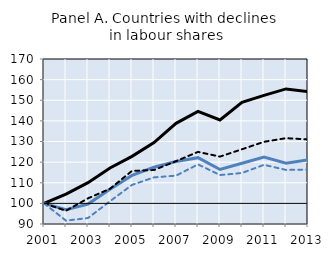
| Category | Labour productivity (Leaders) | Labour productivity (Others) | Real wages (Leaders) | Real wages (Others) | Series 4 |
|---|---|---|---|---|---|
| 2001.0 | 100 | 100 | 100 | 100 |  |
| 2002.0 | 104.525 | 96.957 | 96.423 | 91.634 |  |
| 2003.0 | 110.036 | 99.655 | 102.445 | 92.895 |  |
| 2004.0 | 117.162 | 106.9 | 107.083 | 101.028 |  |
| 2005.0 | 122.787 | 113.545 | 115.755 | 108.959 |  |
| 2006.0 | 129.467 | 117.547 | 116.161 | 112.606 |  |
| 2007.0 | 138.794 | 120.321 | 120.465 | 113.453 |  |
| 2008.0 | 144.59 | 122.159 | 124.954 | 118.897 |  |
| 2009.0 | 140.437 | 116.434 | 122.672 | 113.743 |  |
| 2010.0 | 148.991 | 119.444 | 126.249 | 114.738 |  |
| 2011.0 | 152.381 | 122.425 | 129.85 | 118.69 |  |
| 2012.0 | 155.489 | 119.451 | 131.611 | 116.23 |  |
| 2013.0 | 154.128 | 121.101 | 130.999 | 116.379 |  |